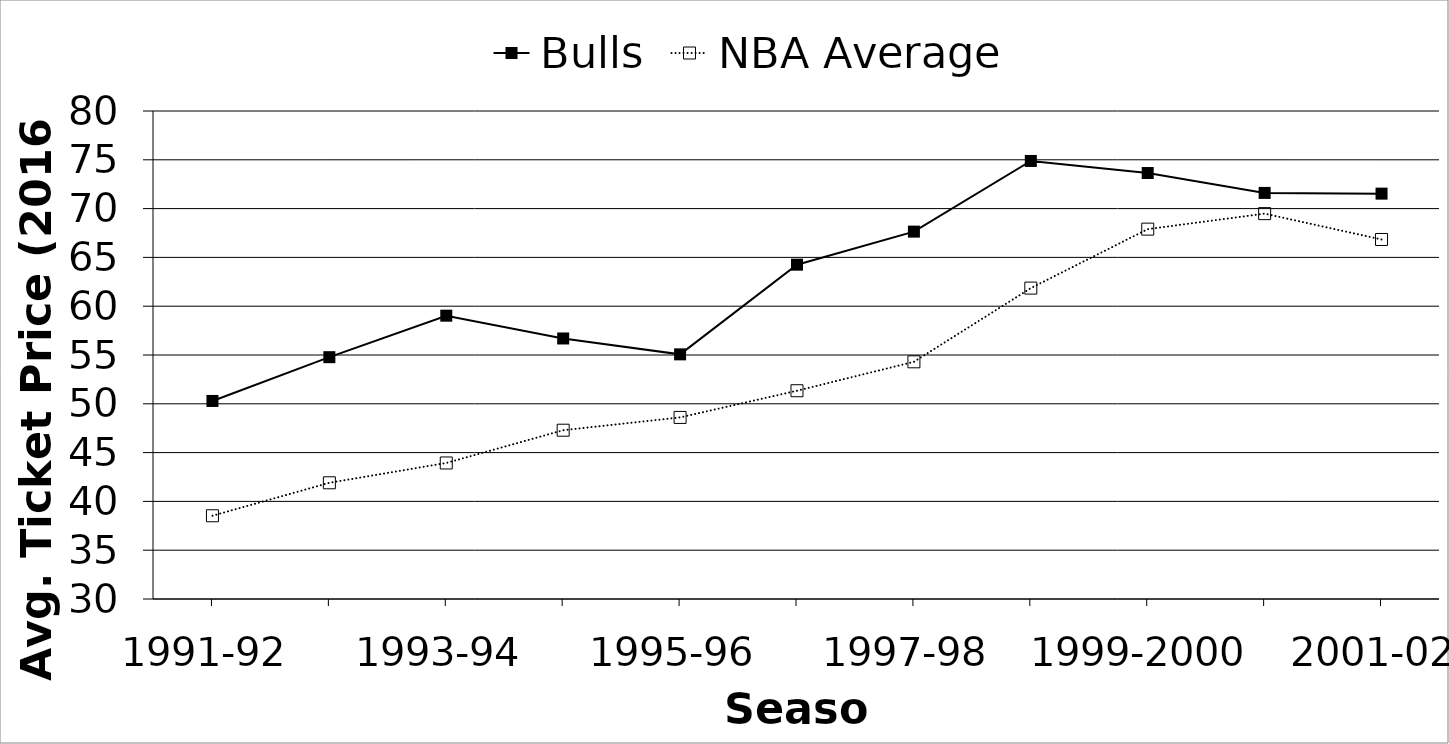
| Category | Bulls | NBA Average |
|---|---|---|
| 1991-92 | 50.292 | 38.529 |
| 1992-93 | 54.776 | 41.907 |
| 1993-94 | 59.028 | 43.938 |
| 1994-95 | 56.693 | 47.294 |
| 1995-96 | 55.067 | 48.604 |
| 1996-97 | 64.254 | 51.34 |
| 1997-98 | 67.642 | 54.303 |
| 1998-99 | 74.881 | 61.854 |
| 1999-2000 | 73.645 | 67.897 |
| 2000-01 | 71.607 | 69.484 |
| 2001-02 | 71.533 | 66.836 |